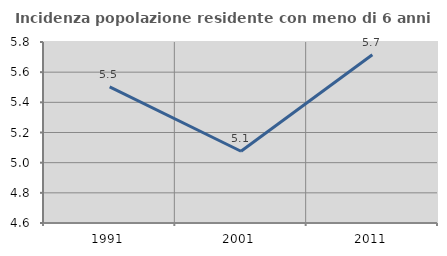
| Category | Incidenza popolazione residente con meno di 6 anni |
|---|---|
| 1991.0 | 5.503 |
| 2001.0 | 5.076 |
| 2011.0 | 5.716 |